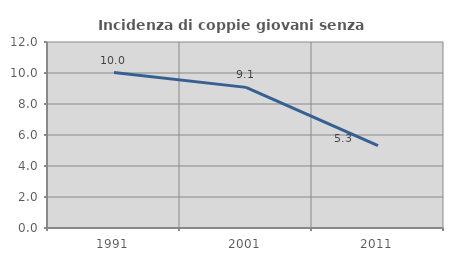
| Category | Incidenza di coppie giovani senza figli |
|---|---|
| 1991.0 | 10.025 |
| 2001.0 | 9.073 |
| 2011.0 | 5.312 |